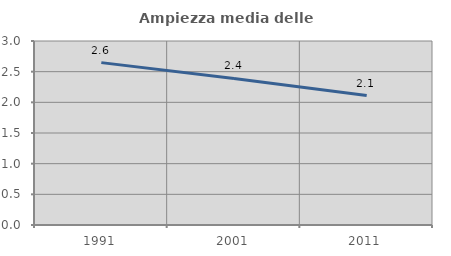
| Category | Ampiezza media delle famiglie |
|---|---|
| 1991.0 | 2.647 |
| 2001.0 | 2.39 |
| 2011.0 | 2.111 |